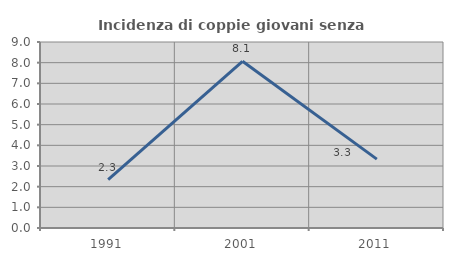
| Category | Incidenza di coppie giovani senza figli |
|---|---|
| 1991.0 | 2.344 |
| 2001.0 | 8.065 |
| 2011.0 | 3.333 |